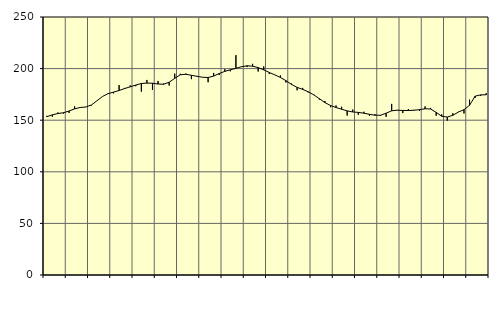
| Category | Piggar | Series 1 |
|---|---|---|
| nan | 154.2 | 153.39 |
| 1.0 | 153.4 | 155.2 |
| 1.0 | 157.5 | 156.45 |
| 1.0 | 156.4 | 157.24 |
| nan | 157 | 158.91 |
| 2.0 | 163.4 | 160.97 |
| 2.0 | 162.2 | 162.32 |
| 2.0 | 162.7 | 162.8 |
| nan | 164.2 | 164.69 |
| 3.0 | 168.8 | 168.73 |
| 3.0 | 172.8 | 172.93 |
| 3.0 | 175.9 | 175.72 |
| nan | 176 | 177.23 |
| 4.0 | 184 | 178.78 |
| 4.0 | 181.3 | 180.68 |
| 4.0 | 183.7 | 182.36 |
| nan | 182.9 | 184.06 |
| 5.0 | 177.7 | 185.59 |
| 5.0 | 189 | 185.94 |
| 5.0 | 179.4 | 185.81 |
| nan | 188 | 185.05 |
| 6.0 | 185.5 | 184.83 |
| 6.0 | 183.6 | 186.76 |
| 6.0 | 195.1 | 190.54 |
| nan | 195 | 194.01 |
| 7.0 | 195.2 | 194.5 |
| 7.0 | 189.8 | 193.5 |
| 7.0 | 192.8 | 192.55 |
| nan | 191.5 | 191.6 |
| 8.0 | 186.8 | 191.4 |
| 8.0 | 195.8 | 192.75 |
| 8.0 | 193.9 | 195.22 |
| nan | 199.4 | 197.31 |
| 9.0 | 197.4 | 198.84 |
| 9.0 | 213 | 200.27 |
| 9.0 | 202 | 201.79 |
| nan | 201.5 | 202.72 |
| 10.0 | 204.6 | 202.33 |
| 10.0 | 197.2 | 200.98 |
| 10.0 | 202.1 | 198.76 |
| nan | 194.7 | 196.26 |
| 11.0 | 194 | 193.88 |
| 11.0 | 193.3 | 191.41 |
| 11.0 | 186.5 | 188.3 |
| nan | 185.6 | 184.66 |
| 12.0 | 179 | 181.82 |
| 12.0 | 181.3 | 179.86 |
| 12.0 | 176.9 | 177.56 |
| nan | 174.9 | 174.53 |
| 13.0 | 170 | 170.85 |
| 13.0 | 168.6 | 167.07 |
| 13.0 | 162.6 | 164.26 |
| nan | 164.3 | 162.29 |
| 14.0 | 163 | 160.64 |
| 14.0 | 154.5 | 159.01 |
| 14.0 | 160.3 | 157.99 |
| nan | 155.2 | 157.58 |
| 15.0 | 158.2 | 156.75 |
| 15.0 | 154.3 | 155.74 |
| 15.0 | 155.8 | 154.82 |
| nan | 154.4 | 154.79 |
| 16.0 | 153.3 | 156.78 |
| 16.0 | 165.8 | 159.09 |
| 16.0 | 159.4 | 159.76 |
| nan | 156.9 | 159.43 |
| 17.0 | 160.8 | 159.38 |
| 17.0 | 160 | 159.63 |
| 17.0 | 158.9 | 160.21 |
| nan | 163.3 | 161.08 |
| 18.0 | 161.9 | 160.84 |
| 18.0 | 154.3 | 157.61 |
| 18.0 | 155.6 | 153.84 |
| nan | 149.6 | 153.03 |
| 19.0 | 156.7 | 154.75 |
| 19.0 | 158.1 | 157.91 |
| 19.0 | 156.5 | 160.18 |
| nan | 169.9 | 164.43 |
| 20.0 | 171.6 | 173.29 |
| 20.0 | 173.6 | 174.55 |
| 20.0 | 176.2 | 174.63 |